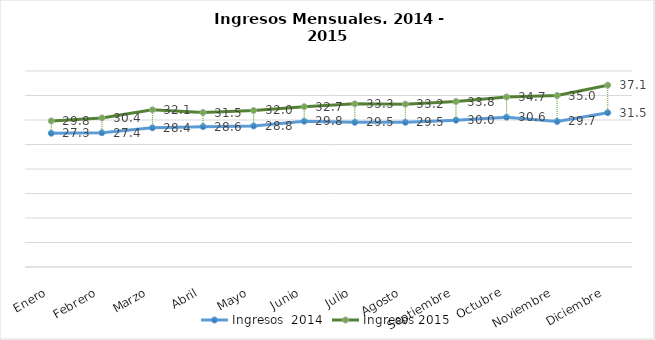
| Category | Ingresos  2014 | Ingresos 2015 |
|---|---|---|
| Enero | 27.304 | 29.817 |
| Febrero | 27.397 | 30.426 |
| Marzo | 28.41 | 32.071 |
| Abril | 28.646 | 31.53 |
| Mayo | 28.785 | 31.951 |
| Junio | 29.752 | 32.712 |
| Julio | 29.531 | 33.292 |
| Agosto | 29.53 | 33.24 |
| Septiembre | 29.966 | 33.766 |
| Octubre | 30.573 | 34.699 |
| Noviembre | 29.706 | 34.997 |
| Diciembre | 31.498 | 37.106 |